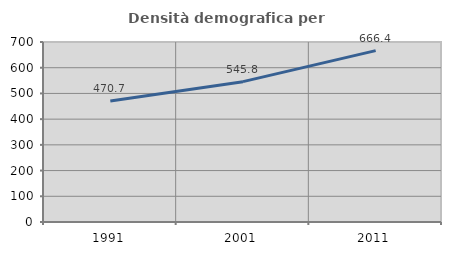
| Category | Densità demografica |
|---|---|
| 1991.0 | 470.688 |
| 2001.0 | 545.764 |
| 2011.0 | 666.408 |